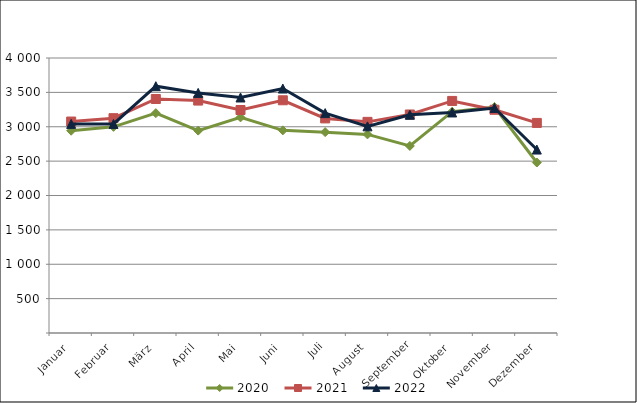
| Category | 2020 | 2021 | 2022 |
|---|---|---|---|
| Januar | 2942.307 | 3075.869 | 3041.601 |
| Februar | 2998.615 | 3124.63 | 3040.984 |
| März | 3197.894 | 3403.806 | 3589.989 |
| April | 2943.993 | 3380.786 | 3492.475 |
| Mai | 3136.379 | 3243.564 | 3425.761 |
| Juni | 2947.316 | 3385.115 | 3555.617 |
| Juli | 2921.784 | 3121.39 | 3198.382 |
| August | 2888.533 | 3071.147 | 3006.05 |
| September | 2721.029 | 3178.618 | 3174.276 |
| Oktober | 3219.535 | 3375.594 | 3207.801 |
| November | 3287.765 | 3247.026 | 3273.381 |
| Dezember | 2479.585 | 3055.864 | 2668.321 |